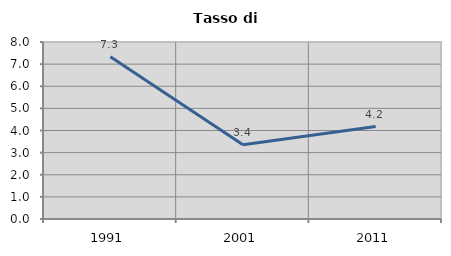
| Category | Tasso di disoccupazione   |
|---|---|
| 1991.0 | 7.332 |
| 2001.0 | 3.353 |
| 2011.0 | 4.176 |